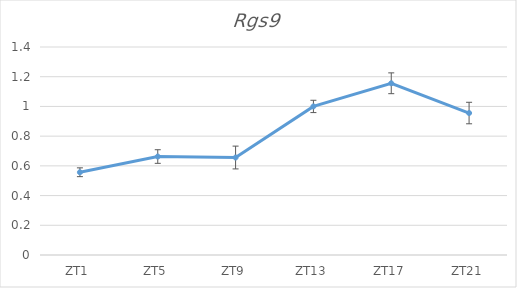
| Category | Series 0 |
|---|---|
| ZT1 | 0.557 |
| ZT5 | 0.663 |
| ZT9 | 0.656 |
| ZT13 | 1 |
| ZT17 | 1.156 |
| ZT21 | 0.956 |